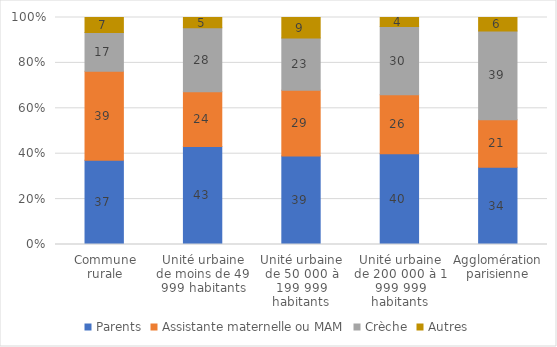
| Category | Parents | Assistante maternelle ou MAM | Crèche | Autres |
|---|---|---|---|---|
| Commune rurale | 37 | 39 | 17 | 6.6 |
| Unité urbaine de moins de 49 999 habitants | 43 | 24 | 28 | 4.5 |
| Unité urbaine de 50 000 à 199 999 habitants | 39 | 29 | 23 | 9 |
| Unité urbaine de 200 000 à 1 999 999 habitants | 40 | 26 | 30 | 4 |
| Agglomération parisienne | 34 | 21 | 39 | 6 |